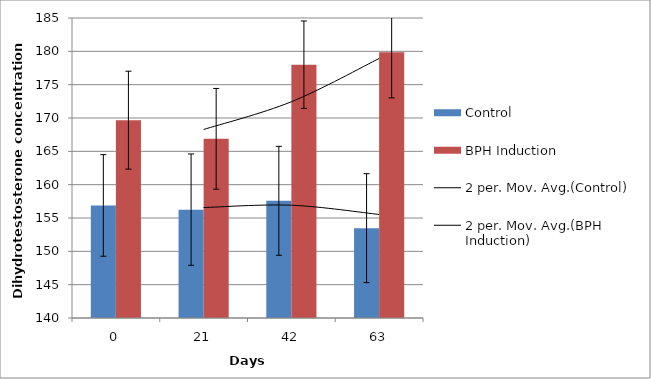
| Category | Control | BPH Induction |
|---|---|---|
| 0.0 | 156.884 | 169.675 |
| 21.0 | 156.255 | 166.878 |
| 42.0 | 157.578 | 177.995 |
| 63.0 | 153.478 | 179.853 |